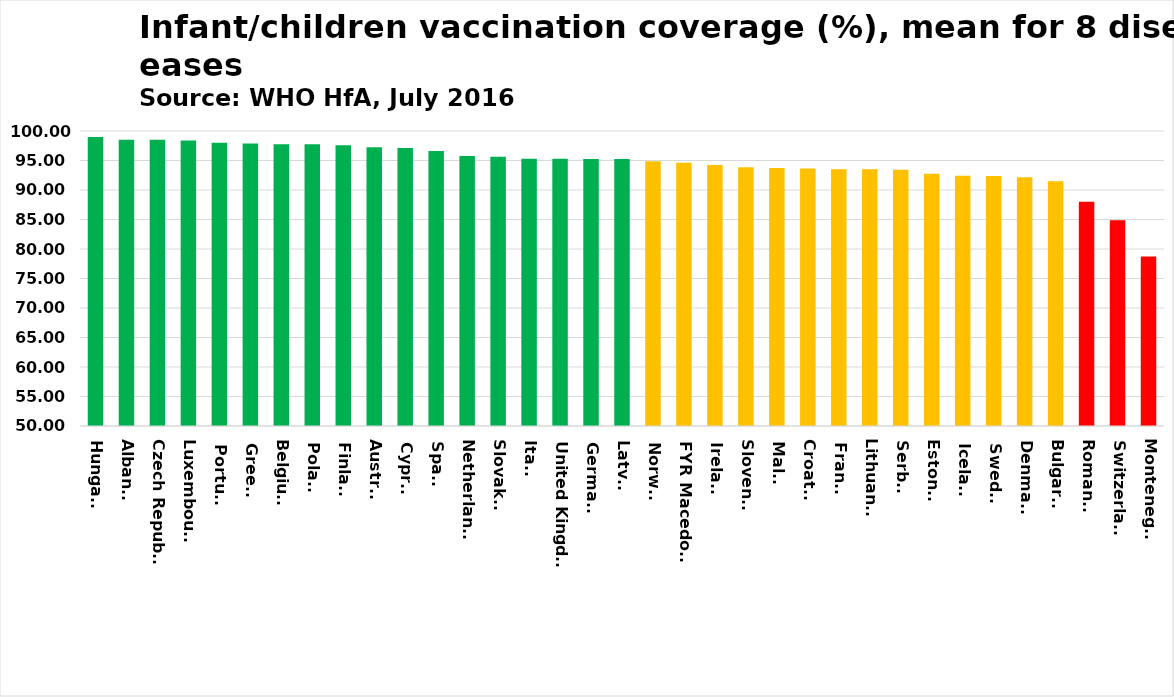
| Category | Series 0 |
|---|---|
| Hungary | 99 |
| Albania | 98.5 |
| Czech Republic | 98.5 |
| Luxembourg | 98.375 |
| Portugal | 98 |
| Greece | 97.875 |
| Belgium | 97.75 |
| Poland | 97.75 |
| Finland | 97.571 |
| Austria | 97.25 |
| Cyprus | 97.1 |
| Spain | 96.625 |
| Netherlands | 95.75 |
| Slovakia | 95.625 |
| Italy | 95.3 |
| United Kingdom | 95.286 |
| Germany | 95.25 |
| Latvia | 95.25 |
| Norway | 94.857 |
| FYR Macedonia | 94.625 |
| Ireland | 94.25 |
| Slovenia | 93.875 |
| Malta | 93.75 |
| Croatia | 93.625 |
| France | 93.5 |
| Lithuania | 93.5 |
| Serbia | 93.413 |
| Estonia | 92.75 |
| Iceland | 92.429 |
| Sweden | 92.375 |
| Denmark | 92.143 |
| Bulgaria | 91.5 |
| Romania | 88 |
| Switzerland | 84.875 |
| Montenegro | 78.75 |